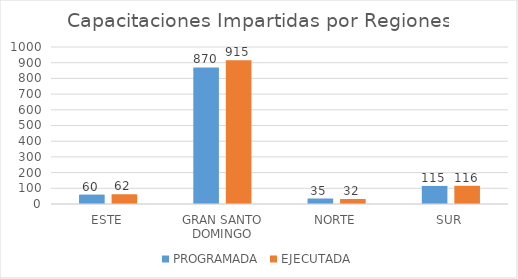
| Category | PROGRAMADA | EJECUTADA |
|---|---|---|
| ESTE | 60 | 62 |
| GRAN SANTO DOMINGO | 870 | 915 |
| NORTE | 35 | 32 |
| SUR | 115 | 116 |